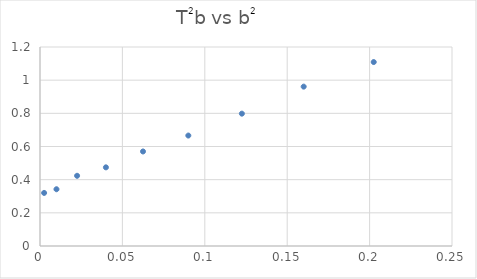
| Category | Series 0 |
|---|---|
| 0.0025000000000000005 | 0.32 |
| 0.010000000000000002 | 0.342 |
| 0.0225 | 0.423 |
| 0.04000000000000001 | 0.474 |
| 0.0625 | 0.57 |
| 0.09 | 0.666 |
| 0.12249999999999998 | 0.798 |
| 0.16000000000000003 | 0.961 |
| 0.2025 | 1.109 |